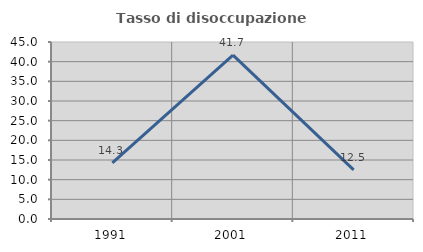
| Category | Tasso di disoccupazione giovanile  |
|---|---|
| 1991.0 | 14.286 |
| 2001.0 | 41.667 |
| 2011.0 | 12.5 |